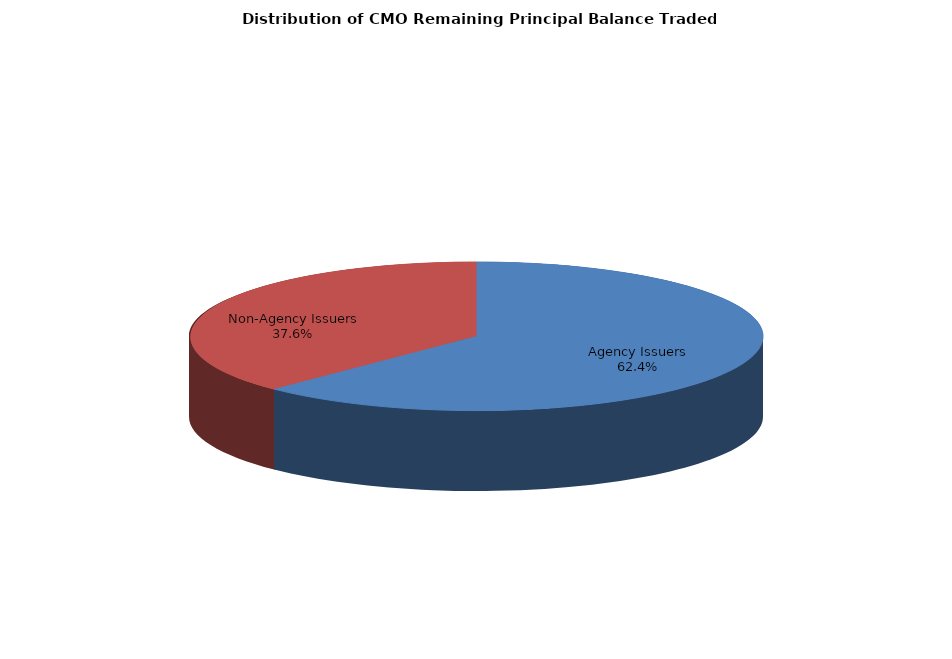
| Category | Series 0 |
|---|---|
| Agency Issuers | 3503486250.282 |
| Non-Agency Issuers | 2109633880.908 |